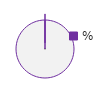
| Category | 2 - Rekenknap |
|---|---|
| 0 | 0 |
| 1 | 1 |